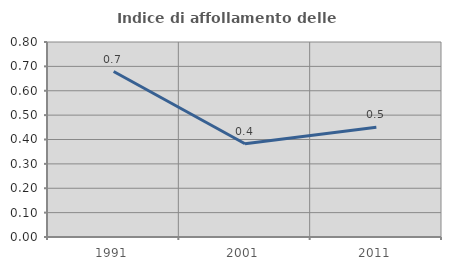
| Category | Indice di affollamento delle abitazioni  |
|---|---|
| 1991.0 | 0.679 |
| 2001.0 | 0.383 |
| 2011.0 | 0.45 |